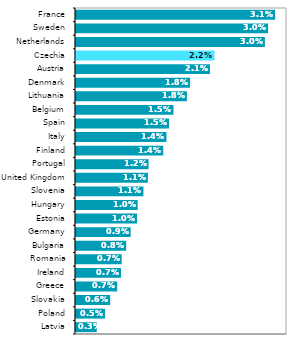
| Category | Series 1 |
|---|---|
| Latvia | 0.003 |
| Poland | 0.005 |
| Slovakia | 0.006 |
| Greece | 0.007 |
| Ireland | 0.007 |
| Romania | 0.007 |
| Bulgaria | 0.008 |
| Germany | 0.009 |
| Estonia | 0.01 |
| Hungary | 0.01 |
| Slovenia | 0.011 |
| United Kingdom | 0.011 |
| Portugal | 0.012 |
| Finland | 0.014 |
| Italy | 0.014 |
| Spain | 0.015 |
| Belgium | 0.015 |
| Lithuania | 0.018 |
| Denmark | 0.018 |
| Austria | 0.021 |
| Czechia | 0.022 |
| Netherlands | 0.03 |
| Sweden | 0.03 |
| France | 0.031 |